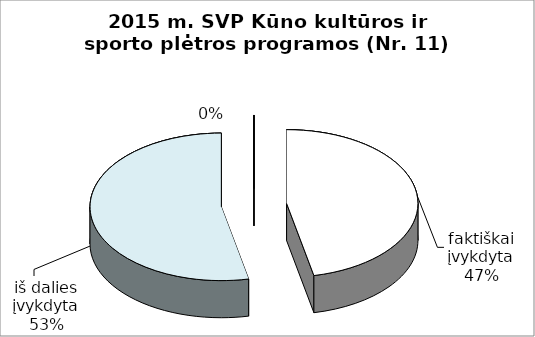
| Category | Series 0 |
|---|---|
| faktiškai įvykdyta | 7 |
| iš dalies įvykdyta | 8 |